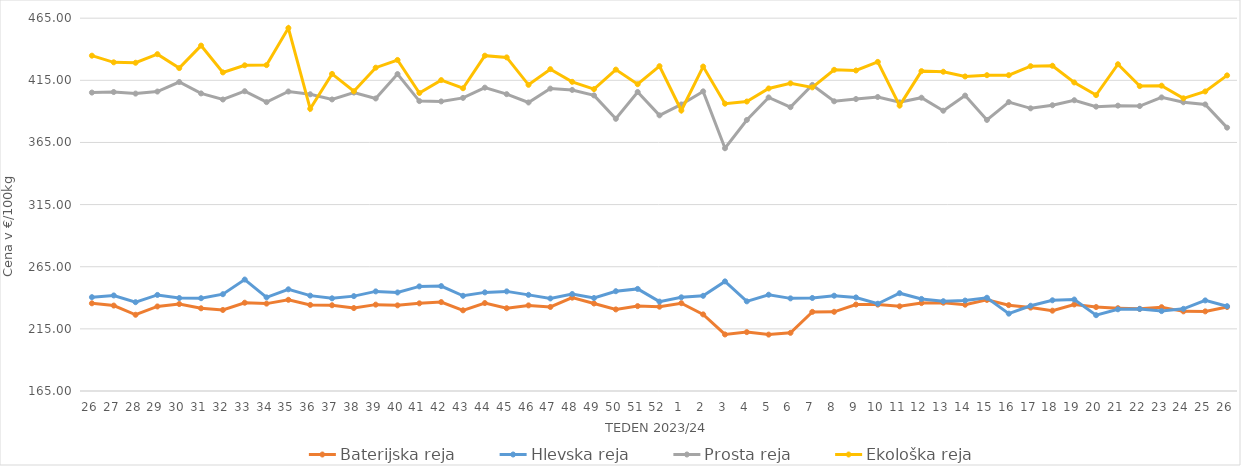
| Category | Baterijska reja | Hlevska reja | Prosta reja | Ekološka reja |
|---|---|---|---|---|
| 26.0 | 235.57 | 240.51 | 405.15 | 434.83 |
| 27.0 | 233.75 | 241.89 | 405.58 | 429.48 |
| 28.0 | 226.35 | 236.46 | 404.32 | 429.14 |
| 29.0 | 233.03 | 242.31 | 405.96 | 436.04 |
| 30.0 | 235 | 239.8 | 413.63 | 424.83 |
| 31.0 | 231.55 | 239.67 | 404.46 | 442.93 |
| 32.0 | 230.2 | 242.89 | 399.57 | 421.38 |
| 33.0 | 236.04 | 254.68 | 406.23 | 427.07 |
| 34.0 | 235.32 | 240.35 | 397.45 | 427.24 |
| 35.0 | 238.39 | 246.82 | 406 | 457.07 |
| 36.0 | 234.27 | 241.75 | 403.79 | 392.07 |
| 37.0 | 234 | 239.58 | 399.61 | 420.17 |
| 38.0 | 231.74 | 241.34 | 405.14 | 406.21 |
| 39.0 | 234.5 | 245.15 | 400.39 | 425.17 |
| 40.0 | 233.92 | 244.29 | 420.04 | 431.38 |
| 41.0 | 235.54 | 249.18 | 398.28 | 404.83 |
| 42.0 | 236.54 | 249.42 | 398.03 | 415.17 |
| 43.0 | 229.92 | 241.62 | 400.86 | 408.62 |
| 44.0 | 235.77 | 244.36 | 409.1 | 434.83 |
| 45.0 | 231.6 | 245.16 | 403.86 | 433.45 |
| 46.0 | 233.89 | 242.36 | 397.17 | 411.38 |
| 47.0 | 232.62 | 239.48 | 408.34 | 423.97 |
| 48.0 | 240.11 | 243.04 | 407.25 | 413.79 |
| 49.0 | 235.41 | 239.81 | 402.87 | 407.93 |
| 50.0 | 230.65 | 245.3 | 384.02 | 423.62 |
| 51.0 | 233.3 | 247.16 | 405.6 | 411.9 |
| 52.0 | 232.85 | 236.91 | 386.82 | 426.38 |
| 1.0 | 235.66 | 240.38 | 395.59 | 390.69 |
| 2.0 | 226.65 | 241.59 | 406.11 | 426.03 |
| 3.0 | 210.5 | 253.21 | 360.35 | 396.21 |
| 4.0 | 212.37 | 237.14 | 383.09 | 397.93 |
| 5.0 | 210.38 | 242.47 | 401.23 | 408.45 |
| 6.0 | 211.82 | 239.54 | 393.39 | 412.59 |
| 7.0 | 228.66 | 239.86 | 411.29 | 409.31 |
| 8.0 | 228.73 | 241.68 | 398.12 | 423.45 |
| 9.0 | 234.57 | 240.29 | 399.93 | 422.93 |
| 10.0 | 234.52 | 235.22 | 401.58 | 429.83 |
| 11.0 | 233.13 | 243.7 | 397.29 | 394.66 |
| 12.0 | 235.73 | 239.09 | 401.01 | 422.41 |
| 13.0 | 236.07 | 237.25 | 390.54 | 421.9 |
| 14.0 | 234.43 | 237.78 | 402.72 | 418.1 |
| 15.0 | 238.3 | 240.04 | 383.13 | 419.14 |
| 16.0 | 234.08 | 227.24 | 397.47 | 419.14 |
| 17.0 | 232.11 | 233.6 | 392.45 | 426.38 |
| 18.0 | 229.63 | 237.99 | 394.95 | 426.72 |
| 19.0 | 234.63 | 238.62 | 398.97 | 413.28 |
| 20.0 | 232.54 | 226.01 | 393.82 | 403.1 |
| 21.0 | 231.64 | 230.74 | 394.63 | 427.93 |
| 22.0 | 231.11 | 231.05 | 394.3 | 410.35 |
| 23.0 | 232.45 | 229.29 | 401.26 | 410.69 |
| 24.0 | 229.09 | 231.11 | 397.37 | 400.52 |
| 25.0 | 229.07 | 237.89 | 395.59 | 406.03 |
| 26.0 | 232.61 | 233.24 | 376.92 | 418.97 |